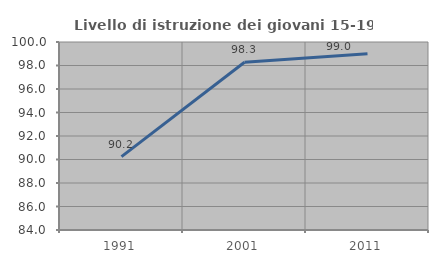
| Category | Livello di istruzione dei giovani 15-19 anni |
|---|---|
| 1991.0 | 90.244 |
| 2001.0 | 98.276 |
| 2011.0 | 99 |